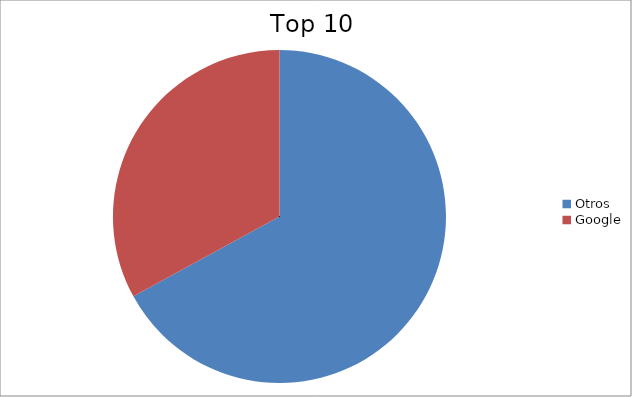
| Category | Series 0 |
|---|---|
| Otros | 67.04 |
| Google | 32.96 |